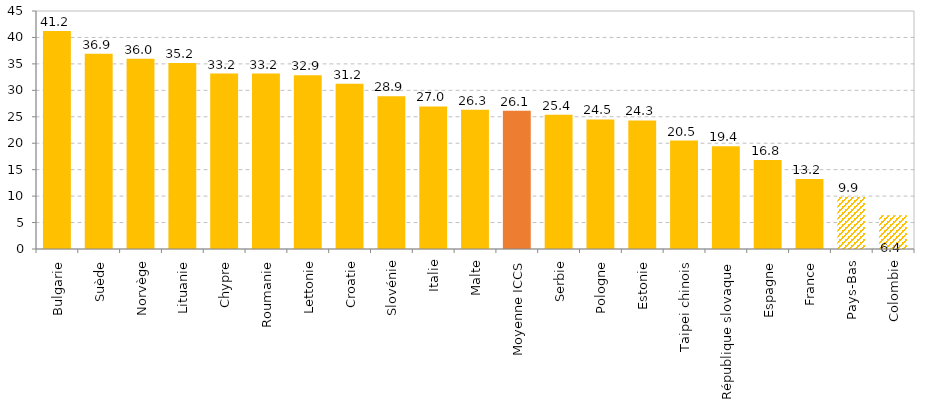
| Category | Difference de score fille-garçons |
|---|---|
| Bulgarie | 41.23 |
| Suède | 36.938 |
| Norvège | 35.982 |
| Lituanie | 35.167 |
| Chypre | 33.171 |
| Roumanie | 33.165 |
| Lettonie | 32.865 |
| Croatie | 31.243 |
| Slovénie | 28.901 |
| Italie | 26.952 |
| Malte | 26.316 |
| Moyenne ICCS | 26.116 |
| Serbie | 25.375 |
| Pologne | 24.497 |
| Estonie | 24.298 |
| Taipei chinois | 20.499 |
| République slovaque | 19.415 |
| Espagne | 16.828 |
| France | 13.24 |
| Pays-Bas | 9.872 |
| Colombie | 6.372 |